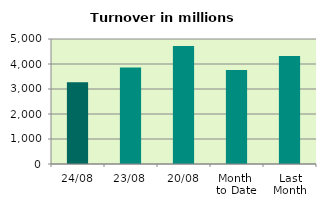
| Category | Series 0 |
|---|---|
| 24/08 | 3270.584 |
| 23/08 | 3855.995 |
| 20/08 | 4724.438 |
| Month 
to Date | 3759.116 |
| Last
Month | 4319.965 |